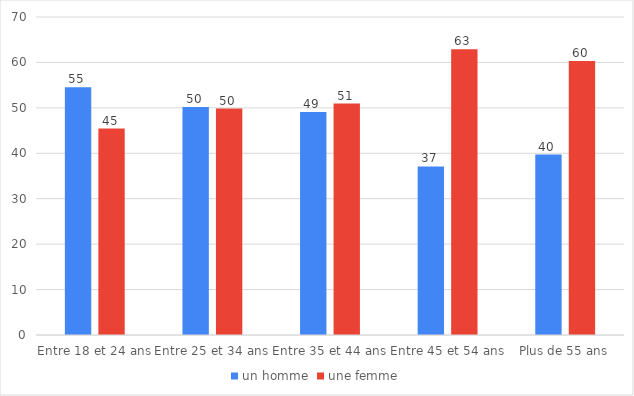
| Category | un homme | une femme |
|---|---|---|
| Entre 18 et 24 ans | 54.545 | 45.455 |
| Entre 25 et 34 ans | 50.164 | 49.836 |
| Entre 35 et 44 ans | 49.068 | 50.932 |
| Entre 45 et 54 ans | 37.118 | 62.882 |
| Plus de 55 ans | 39.706 | 60.294 |